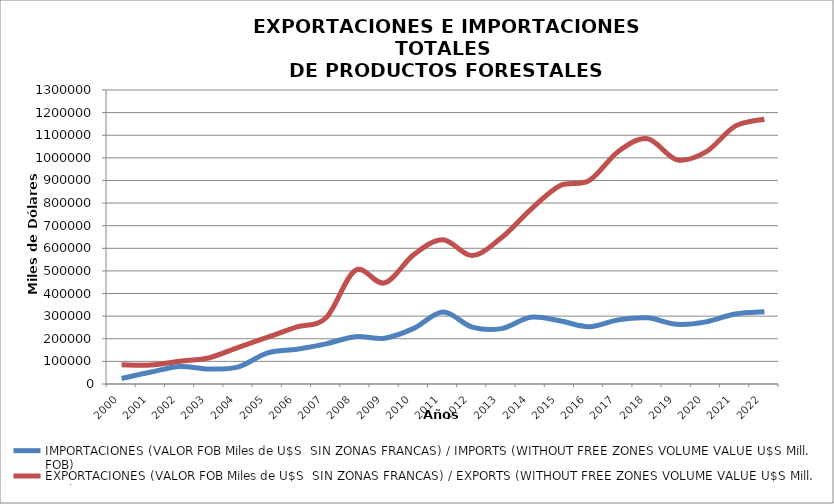
| Category | IMPORTACIONES (VALOR FOB Miles de U$S  SIN ZONAS FRANCAS) / IMPORTS (WITHOUT FREE ZONES VOLUME VALUE U$S Mill. FOB) | EXPORTACIONES (VALOR FOB Miles de U$S  SIN ZONAS FRANCAS) / EXPORTS (WITHOUT FREE ZONES VOLUME VALUE U$S Mill. FOB) |
|---|---|---|
| 2000.0 | 24200 | 85189 |
| 2001.0 | 52867 | 83915 |
| 2002.0 | 77559 | 100530 |
| 2003.0 | 66009 | 116276 |
| 2004.0 | 76077 | 162381 |
| 2005.0 | 137557 | 206800 |
| 2006.0 | 153582 | 252344 |
| 2007.0 | 177585 | 293023 |
| 2008.0 | 209366 | 502390 |
| 2009.0 | 202481 | 446887 |
| 2010.0 | 245891 | 572032 |
| 2011.0 | 317995 | 638068 |
| 2012.0 | 251502.879 | 567836.475 |
| 2013.0 | 244892.682 | 646890.896 |
| 2014.0 | 295157.369 | 771420.467 |
| 2015.0 | 279463.658 | 877126.549 |
| 2016.0 | 253183.937 | 898962.309 |
| 2017.0 | 283598.828 | 1028222.142 |
| 2018.0 | 292519.623 | 1084780.89 |
| 2019.0 | 264127.004 | 991636.55 |
| 2020.0 | 274703.32 | 1026046.382 |
| 2021.0 | 309568.775 | 1140075.158 |
| 2022.0 | 319582.119 | 1170885.375 |